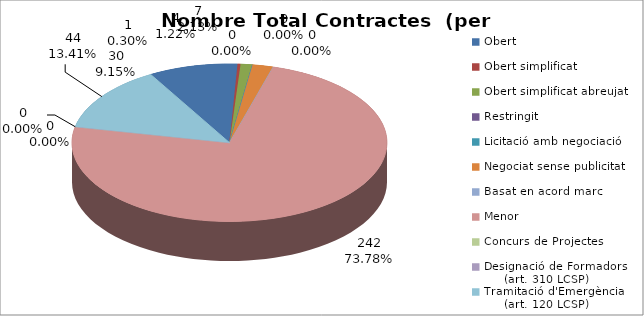
| Category | Nombre Total Contractes |
|---|---|
| Obert | 30 |
| Obert simplificat | 1 |
| Obert simplificat abreujat | 4 |
| Restringit | 0 |
| Licitació amb negociació | 0 |
| Negociat sense publicitat | 7 |
| Basat en acord marc | 0 |
| Menor | 242 |
| Concurs de Projectes | 0 |
| Designació de Formadors
     (art. 310 LCSP) | 0 |
| Tramitació d'Emergència
     (art. 120 LCSP) | 44 |